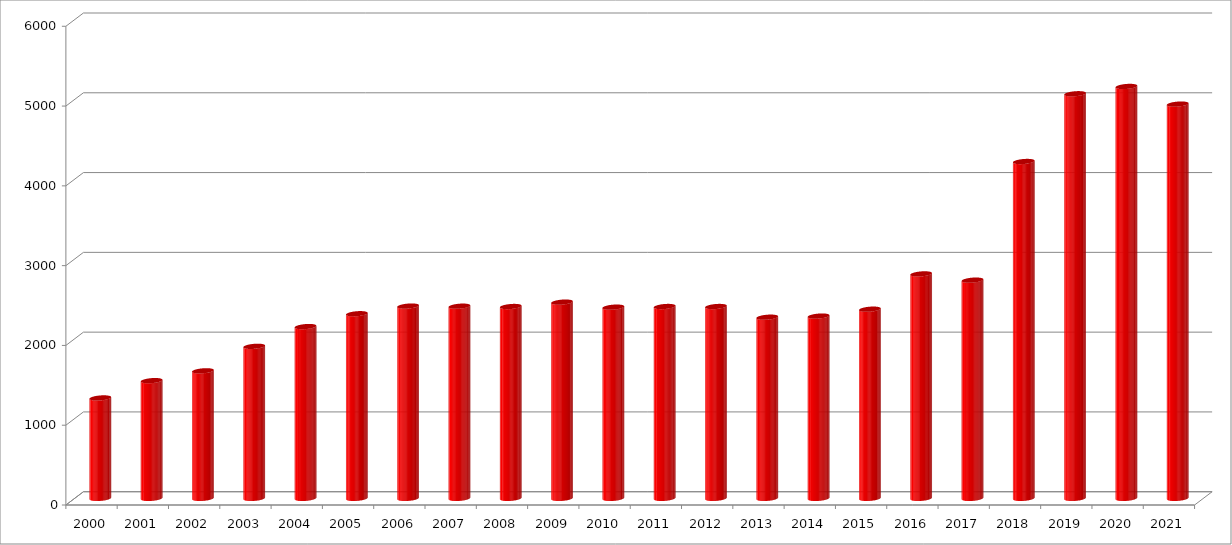
| Category | Series 0 |
|---|---|
| 2000.0 | 1258.5 |
| 2001.0 | 1475.5 |
| 2002.0 | 1598.5 |
| 2003.0 | 1905.5 |
| 2004.0 | 2153 |
| 2005.0 | 2314 |
| 2006.0 | 2410 |
| 2007.0 | 2408.5 |
| 2008.0 | 2404.5 |
| 2009.0 | 2459.5 |
| 2010.0 | 2396.5 |
| 2011.0 | 2404.5 |
| 2012.0 | 2404.5 |
| 2013.0 | 2270.5 |
| 2014.0 | 2284.5 |
| 2015.0 | 2371 |
| 2016.0 | 2813 |
| 2017.0 | 2735 |
| 2018.0 | 4222 |
| 2019.0 | 5071 |
| 2020.0 | 5162.5 |
| 2021.0 | 4941.5 |